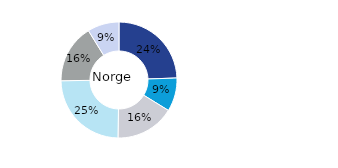
| Category | Norge |
|---|---|
| Kontor | 0.244 |
| Bostäder | 0.093 |
| Handel | 0.165 |
| Logistik* | 0.245 |
| Samhällsfastigheter** | 0.164 |
| Övrigt | 0.088 |